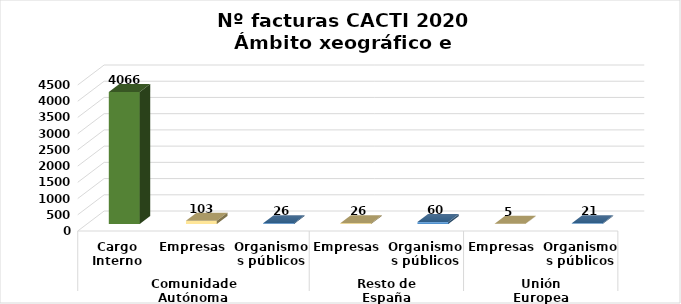
| Category | Series 0 |
|---|---|
| 0 | 4066 |
| 1 | 103 |
| 2 | 26 |
| 3 | 26 |
| 4 | 60 |
| 5 | 5 |
| 6 | 21 |